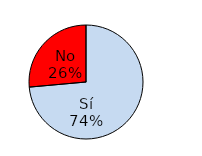
| Category | Series 1 |
|---|---|
| Sí | 128 |
| No | 46 |